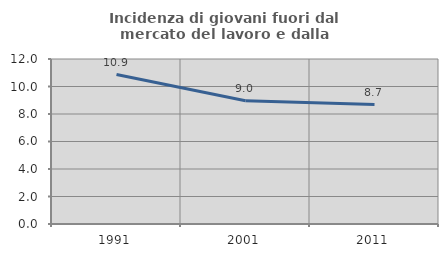
| Category | Incidenza di giovani fuori dal mercato del lavoro e dalla formazione  |
|---|---|
| 1991.0 | 10.87 |
| 2001.0 | 8.962 |
| 2011.0 | 8.683 |